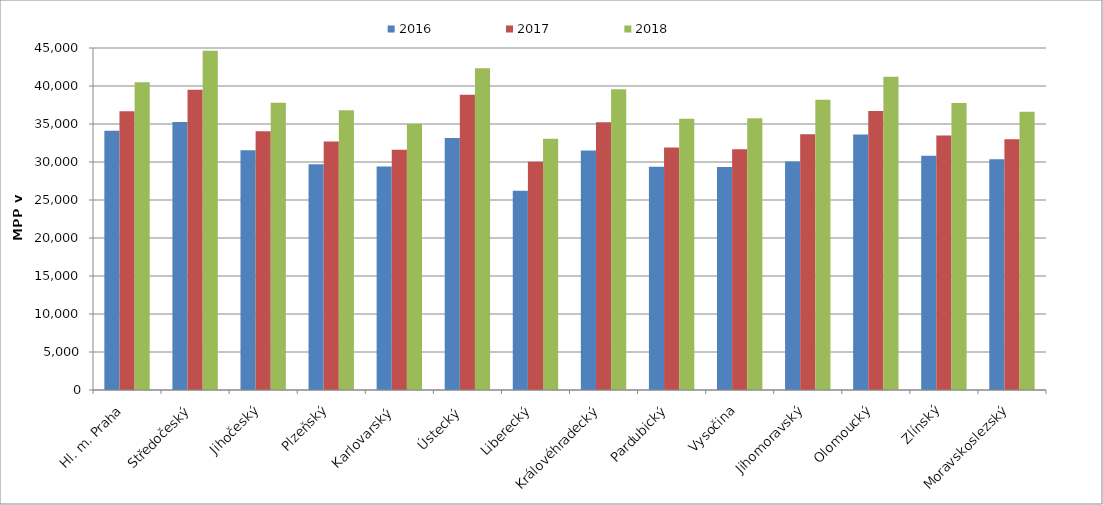
| Category | 2016 | 2017 | 2018 |
|---|---|---|---|
| Hl. m. Praha | 34112.572 | 36666.288 | 40483.698 |
| Středočeský | 35266.526 | 39494.862 | 44628.235 |
| Jihočeský | 31558.743 | 34041.477 | 37786.569 |
| Plzeňský | 29690.941 | 32705.435 | 36805.525 |
| Karlovarský  | 29394.495 | 31596.33 | 35009.174 |
| Ústecký   | 33152.459 | 38843.035 | 42338.392 |
| Liberecký | 26206.457 | 30029.528 | 33052.507 |
| Královéhradecký | 31522.774 | 35236.043 | 39577.669 |
| Pardubický | 29361.714 | 31913.837 | 35676.662 |
| Vysočina | 29339.221 | 31686.655 | 35742.471 |
| Jihomoravský | 30056.369 | 33652.273 | 38190.909 |
| Olomoucký | 33628.708 | 36705.609 | 41220.116 |
| Zlínský | 30832.653 | 33475.981 | 37758.241 |
| Moravskoslezský | 30365.68 | 32992.516 | 36608.861 |